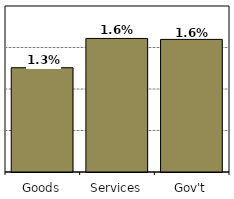
| Category | Series 0 |
|---|---|
| Goods | 0.013 |
| Services | 0.016 |
| Gov't | 0.016 |